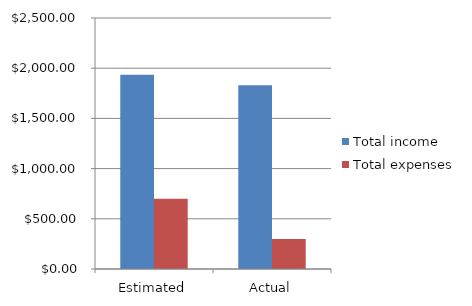
| Category | Total income | Total expenses |
|---|---|---|
| Estimated | 1936 | 700 |
| Actual | 1831 | 300 |